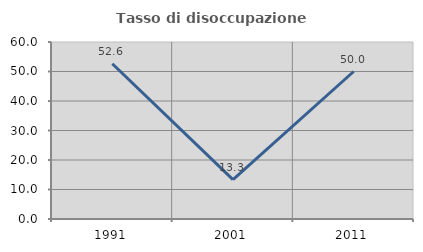
| Category | Tasso di disoccupazione giovanile  |
|---|---|
| 1991.0 | 52.632 |
| 2001.0 | 13.333 |
| 2011.0 | 50 |